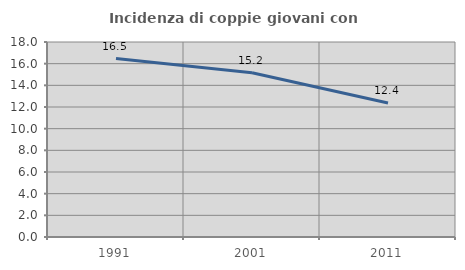
| Category | Incidenza di coppie giovani con figli |
|---|---|
| 1991.0 | 16.467 |
| 2001.0 | 15.16 |
| 2011.0 | 12.372 |